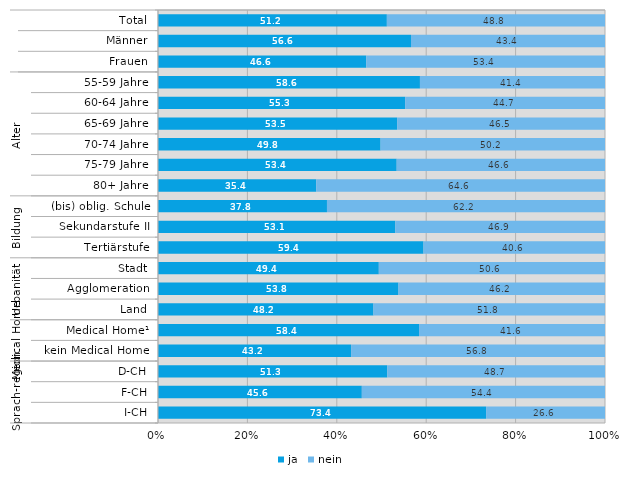
| Category | ja | nein |
|---|---|---|
| 0 | 51.2 | 48.8 |
| 1 | 56.6 | 43.4 |
| 2 | 46.6 | 53.4 |
| 3 | 58.6 | 41.4 |
| 4 | 55.3 | 44.7 |
| 5 | 53.5 | 46.5 |
| 6 | 49.8 | 50.2 |
| 7 | 53.4 | 46.6 |
| 8 | 35.4 | 64.6 |
| 9 | 37.8 | 62.2 |
| 10 | 53.1 | 46.9 |
| 11 | 59.4 | 40.6 |
| 12 | 49.4 | 50.6 |
| 13 | 53.8 | 46.2 |
| 14 | 48.2 | 51.8 |
| 15 | 58.4 | 41.6 |
| 16 | 43.2 | 56.8 |
| 17 | 51.3 | 48.7 |
| 18 | 45.6 | 54.4 |
| 19 | 73.4 | 26.6 |